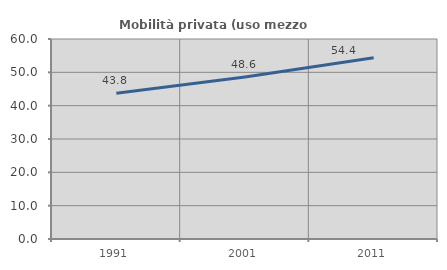
| Category | Mobilità privata (uso mezzo privato) |
|---|---|
| 1991.0 | 43.75 |
| 2001.0 | 48.571 |
| 2011.0 | 54.369 |